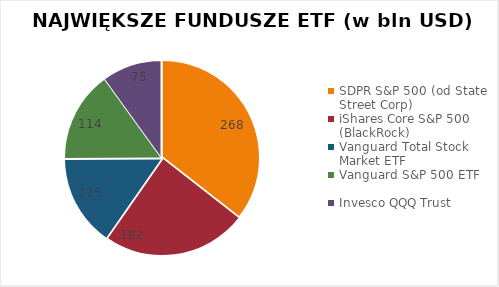
| Category | Series 0 |
|---|---|
| SDPR S&P 500 (od State Street Corp) | 268 |
| iShares Core S&P 500 (BlackRock) | 182 |
| Vanguard Total Stock Market ETF | 115 |
| Vanguard S&P 500 ETF | 114 |
| Invesco QQQ Trust | 75 |